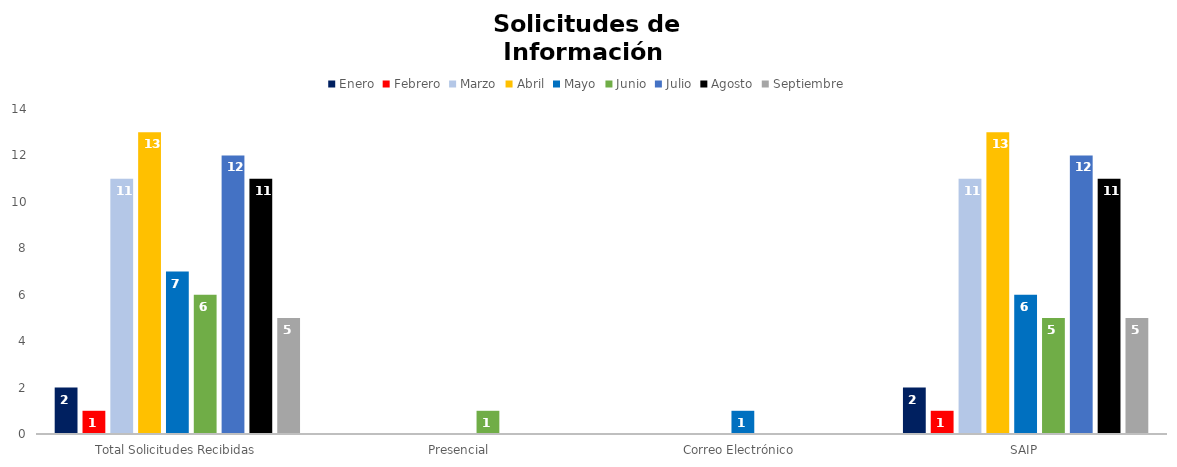
| Category | Enero | Febrero | Marzo | Abril | Mayo | Junio | Julio | Agosto | Septiembre |
|---|---|---|---|---|---|---|---|---|---|
| Total Solicitudes Recibidas | 2 | 1 | 11 | 13 | 7 | 6 | 12 | 11 | 5 |
| Presencial | 0 | 0 | 0 | 0 | 0 | 1 | 0 | 0 | 0 |
| Correo Electrónico  | 0 | 0 | 0 | 0 | 1 | 0 | 0 | 0 | 0 |
| SAIP | 2 | 1 | 11 | 13 | 6 | 5 | 12 | 11 | 5 |